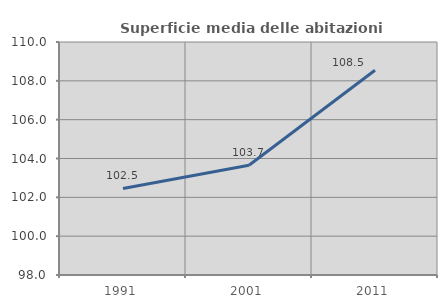
| Category | Superficie media delle abitazioni occupate |
|---|---|
| 1991.0 | 102.457 |
| 2001.0 | 103.655 |
| 2011.0 | 108.541 |